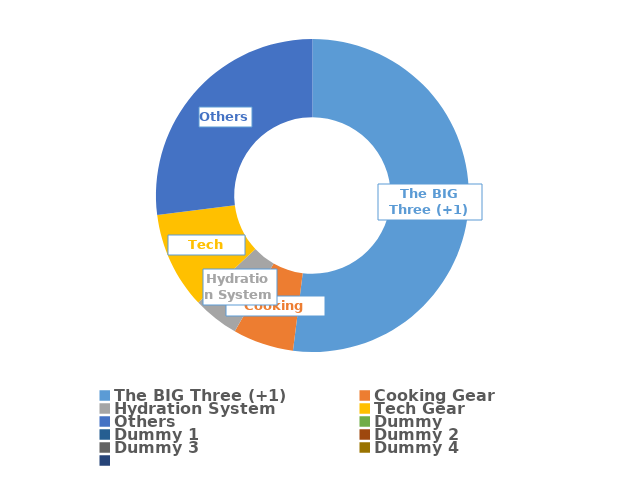
| Category | Series 0 |
|---|---|
| The BIG Three (+1) | 6.703 |
| Cooking Gear | 0.809 |
| Hydration System | 0.612 |
| Tech Gear | 1.288 |
| Others | 3.478 |
| Dummy | 0 |
| Dummy 1 | 0 |
| Dummy 2 | 0 |
| Dummy 3 | 0 |
| Dummy 4 | 0 |